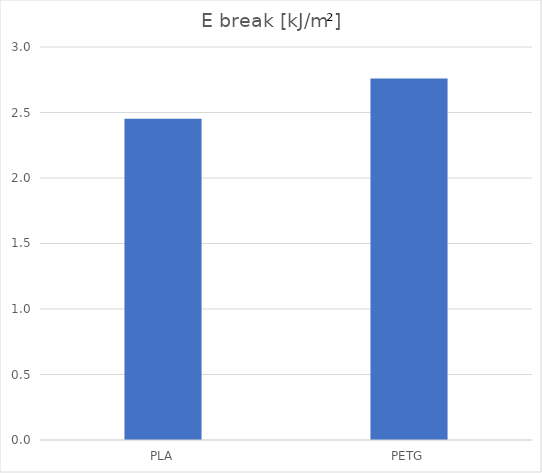
| Category | kJ/m² |
|---|---|
| PLA | 2.452 |
| PETG | 2.759 |